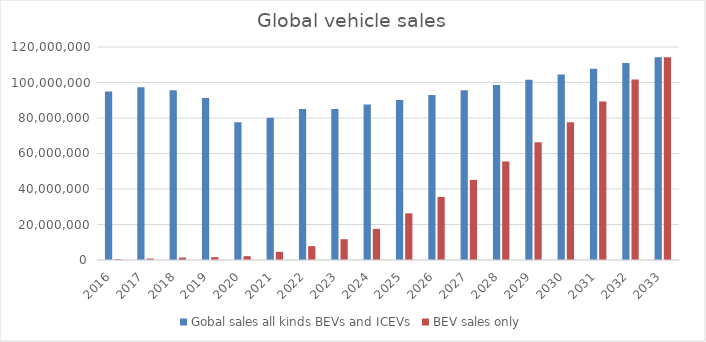
| Category | Gobal sales all kinds BEVs and ICEVs | BEV sales only |
|---|---|---|
| 2016.0 | 94976569 | 477700 |
| 2017.0 | 97302534 | 801600 |
| 2018.0 | 95634593 | 1367800 |
| 2019.0 | 91227182 | 1624600 |
| 2020.0 | 77621582 | 2165400 |
| 2021.0 | 80145988 | 4599400 |
| 2022.0 | 85016728 | 7800000 |
| 2023.0 | 85016728 | 11700000 |
| 2024.0 | 87567229.84 | 17550000 |
| 2025.0 | 90194246.735 | 26325000 |
| 2026.0 | 92900074.137 | 35538750 |
| 2027.0 | 95687076.361 | 45134212.5 |
| 2028.0 | 98557688.652 | 55515081.375 |
| 2029.0 | 101514419.312 | 66340522.243 |
| 2030.0 | 104559851.891 | 77618411.024 |
| 2031.0 | 107696647.448 | 89261172.678 |
| 2032.0 | 110927546.871 | 101757736.853 |
| 2033.0 | 114255373.277 | 114255373.277 |